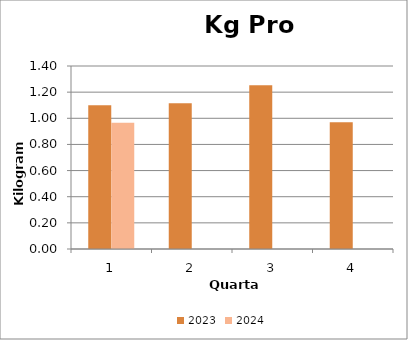
| Category | 2023 | 2024 |
|---|---|---|
| 0 | 1.1 | 0.967 |
| 1 | 1.116 | 0 |
| 2 | 1.252 | 0 |
| 3 | 0.97 | 0 |